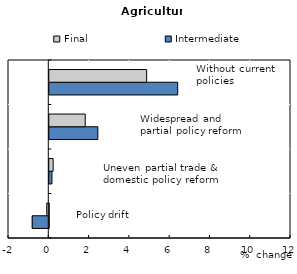
| Category | Intermediate | Final |
|---|---|---|
| Policy drift | -0.822 | -0.099 |
| Uneven partial trade & domestic policy reform | 0.132 | 0.191 |
| Widespread partial policy reform | 2.411 | 1.784 |
| Without current policies | 6.374 | 4.833 |